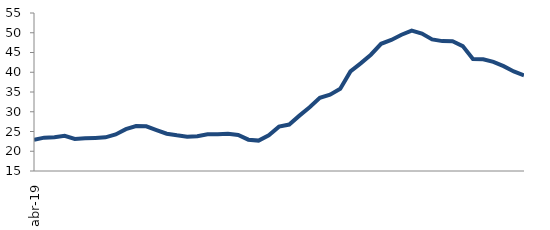
| Category | Series 0 |
|---|---|
| 2019-04-01 | 22.879 |
| 2019-05-01 | 23.44 |
| 2019-06-01 | 23.564 |
| 2019-07-01 | 23.893 |
| 2019-08-01 | 23.133 |
| 2019-09-01 | 23.263 |
| 2019-10-01 | 23.369 |
| 2019-11-01 | 23.525 |
| 2019-12-01 | 24.256 |
| 2020-01-01 | 25.597 |
| 2020-02-01 | 26.375 |
| 2020-03-01 | 26.322 |
| 2020-04-01 | 25.369 |
| 2020-05-01 | 24.446 |
| 2020-06-01 | 24.028 |
| 2020-07-01 | 23.685 |
| 2020-08-01 | 23.782 |
| 2020-09-01 | 24.28 |
| 2020-10-01 | 24.323 |
| 2020-11-01 | 24.433 |
| 2020-12-01 | 24.131 |
| 2021-01-01 | 22.928 |
| 2021-02-01 | 22.701 |
| 2021-03-01 | 24.039 |
| 2021-04-01 | 26.229 |
| 2021-05-01 | 26.758 |
| 2021-06-01 | 29.013 |
| 2021-07-01 | 31.153 |
| 2021-08-01 | 33.54 |
| 2021-09-01 | 34.33 |
| 2021-10-01 | 35.804 |
| 2021-11-01 | 40.209 |
| 2021-12-01 | 42.248 |
| 2022-01-01 | 44.446 |
| 2022-02-01 | 47.198 |
| 2022-03-01 | 48.169 |
| 2022-04-01 | 49.498 |
| 2022-05-01 | 50.558 |
| 2022-06-01 | 49.814 |
| 2022-07-01 | 48.326 |
| 2022-08-01 | 47.883 |
| 2022-09-01 | 47.867 |
| 2022-10-01 | 46.623 |
| 2022-11-01 | 43.376 |
| 2022-12-01 | 43.275 |
| 2023-01-01 | 42.634 |
| 2023-02-01 | 41.54 |
| 2023-03-01 | 40.198 |
| 2023-04-01 | 39.238 |